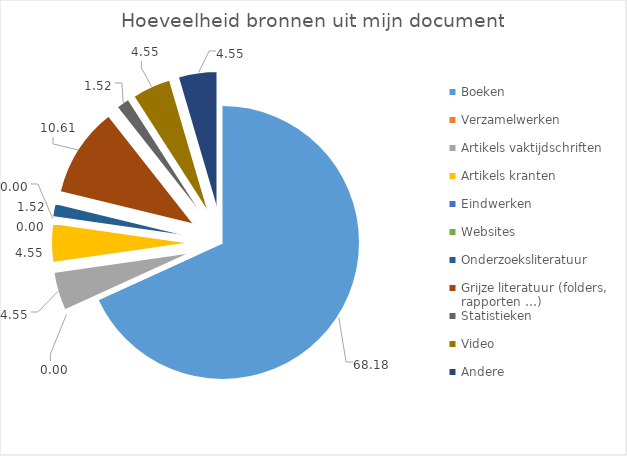
| Category | Series 0 |
|---|---|
| Boeken | 68.182 |
| Verzamelwerken | 0 |
| Artikels vaktijdschriften | 4.545 |
| Artikels kranten | 4.545 |
| Eindwerken | 0 |
| Websites | 0 |
| Onderzoeksliteratuur | 1.515 |
| Grijze literatuur (folders, rapporten …) | 10.606 |
| Statistieken | 1.515 |
| Video | 4.545 |
| Andere | 4.545 |